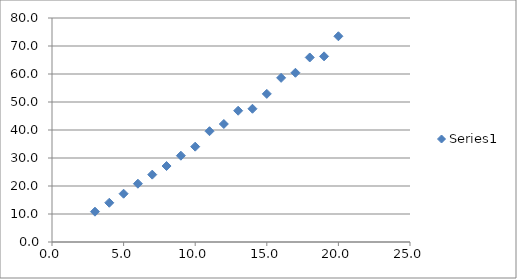
| Category | Series 0 |
|---|---|
| 3.0 | 10.828 |
| 4.0 | 14.013 |
| 5.0 | 17.246 |
| 6.0 | 20.817 |
| 7.0 | 24.062 |
| 8.0 | 27.134 |
| 9.0 | 30.821 |
| 10.0 | 34.047 |
| 11.0 | 39.567 |
| 12.0 | 42.146 |
| 13.0 | 46.882 |
| 14.0 | 47.586 |
| 15.0 | 52.899 |
| 16.0 | 58.622 |
| 17.0 | 60.439 |
| 18.0 | 65.902 |
| 19.0 | 66.309 |
| 20.0 | 73.481 |